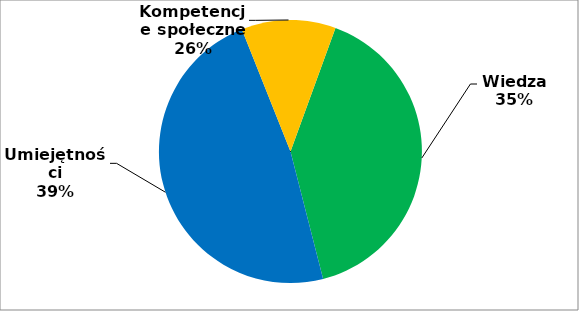
| Category | Series 0 |
|---|---|
| 0 | 178 |
| 1 | 211 |
| 2 | 51 |